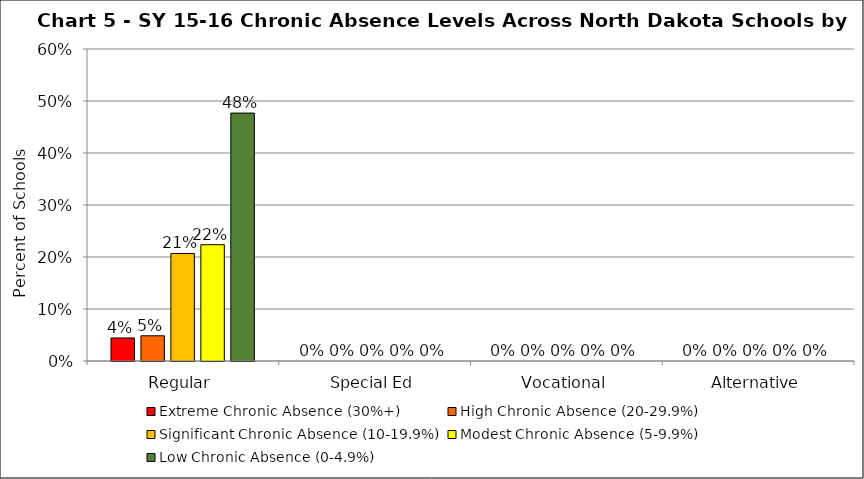
| Category | Extreme Chronic Absence (30%+) | High Chronic Absence (20-29.9%) | Significant Chronic Absence (10-19.9%) | Modest Chronic Absence (5-9.9%) | Low Chronic Absence (0-4.9%) |
|---|---|---|---|---|---|
| 0 | 0.044 | 0.049 | 0.207 | 0.224 | 0.477 |
| 1 | 0 | 0 | 0 | 0 | 0 |
| 2 | 0 | 0 | 0 | 0 | 0 |
| 3 | 0 | 0 | 0 | 0 | 0 |